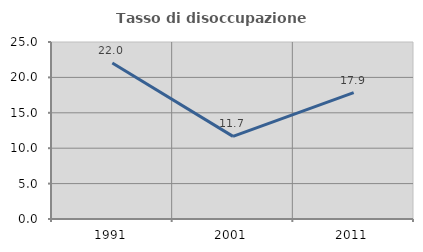
| Category | Tasso di disoccupazione giovanile  |
|---|---|
| 1991.0 | 22.034 |
| 2001.0 | 11.667 |
| 2011.0 | 17.857 |